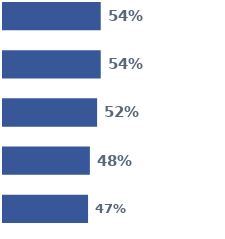
| Category | Series 0 | Series 1 | Series 2 | Series 3 | Series 4 |
|---|---|---|---|---|---|
| 0 | 0.54 | 0.54 | 0.52 | 0.48 | 0.47 |